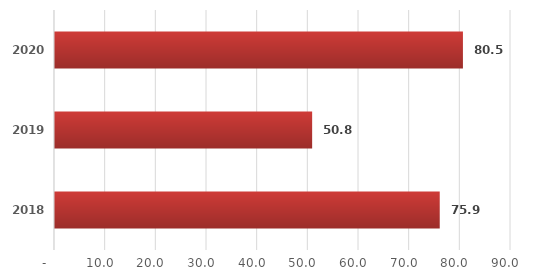
| Category | Series 0 |
|---|---|
| 2018.0 | 75.935 |
| 2019.0 | 50.753 |
| 2020.0 | 80.512 |